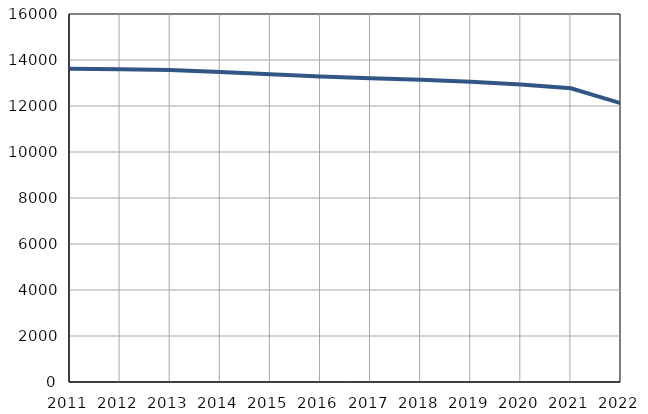
| Category | Population
size |
|---|---|
| 2011.0 | 13622 |
| 2012.0 | 13600 |
| 2013.0 | 13566 |
| 2014.0 | 13478 |
| 2015.0 | 13379 |
| 2016.0 | 13285 |
| 2017.0 | 13205 |
| 2018.0 | 13141 |
| 2019.0 | 13057 |
| 2020.0 | 12939 |
| 2021.0 | 12772 |
| 2022.0 | 12117 |